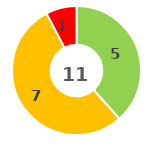
| Category | Series 0 |
|---|---|
| 0 | 0 |
| 1 | 5 |
| 2 | 7 |
| 3 | 1 |
| 4 | 0 |